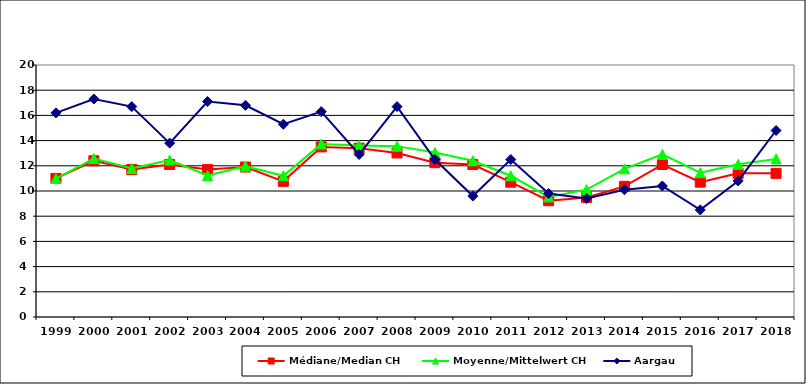
| Category | Médiane/Median CH | Moyenne/Mittelwert CH | Aargau |
|---|---|---|---|
| 1999.0 | 11 | 10.991 | 16.2 |
| 2000.0 | 12.4 | 12.575 | 17.3 |
| 2001.0 | 11.7 | 11.788 | 16.7 |
| 2002.0 | 12.1 | 12.452 | 13.8 |
| 2003.0 | 11.7 | 11.236 | 17.1 |
| 2004.0 | 11.9 | 11.971 | 16.8 |
| 2005.0 | 10.768 | 11.206 | 15.3 |
| 2006.0 | 13.5 | 13.724 | 16.3 |
| 2007.0 | 13.4 | 13.616 | 12.9 |
| 2008.0 | 13.02 | 13.561 | 16.7 |
| 2009.0 | 12.25 | 13.048 | 12.5 |
| 2010.0 | 12.1 | 12.4 | 9.6 |
| 2011.0 | 10.7 | 11.209 | 12.5 |
| 2012.0 | 9.23 | 9.534 | 9.8 |
| 2013.0 | 9.49 | 10.106 | 9.4 |
| 2014.0 | 10.37 | 11.762 | 10.1 |
| 2015.0 | 12.1 | 12.906 | 10.4 |
| 2016.0 | 10.7 | 11.448 | 8.5 |
| 2017.0 | 11.4 | 12.116 | 10.8 |
| 2018.0 | 11.4 | 12.549 | 14.8 |